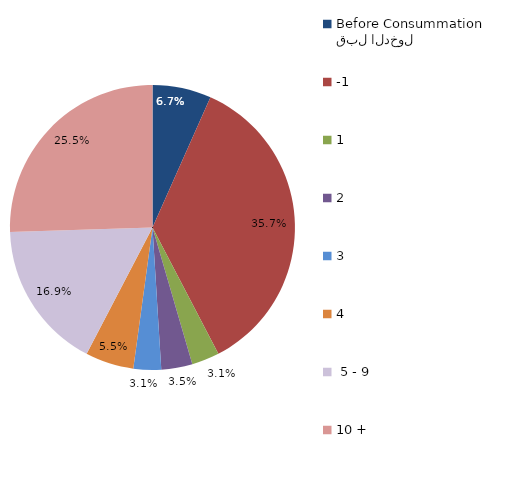
| Category | Series 0 |
|---|---|
| قبل الدخول
Before Consummation | 6.667 |
| -1 | 35.686 |
| 1 | 3.137 |
| 2 | 3.529 |
| 3 | 3.137 |
| 4 | 5.49 |
|  5 - 9 | 16.863 |
| 10 + | 25.49 |